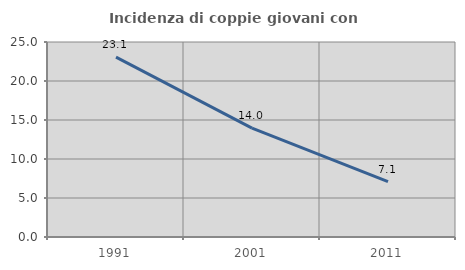
| Category | Incidenza di coppie giovani con figli |
|---|---|
| 1991.0 | 23.064 |
| 2001.0 | 13.963 |
| 2011.0 | 7.104 |